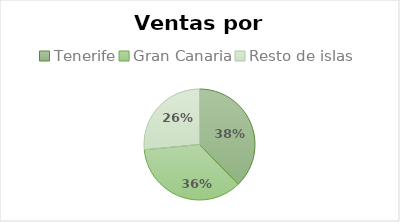
| Category | Total |
|---|---|
| Tenerife | 180590 |
| Gran Canaria | 171366 |
| Resto de islas | 127110 |